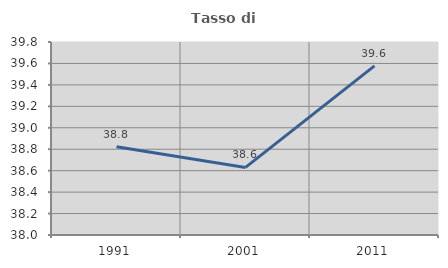
| Category | Tasso di occupazione   |
|---|---|
| 1991.0 | 38.824 |
| 2001.0 | 38.63 |
| 2011.0 | 39.578 |